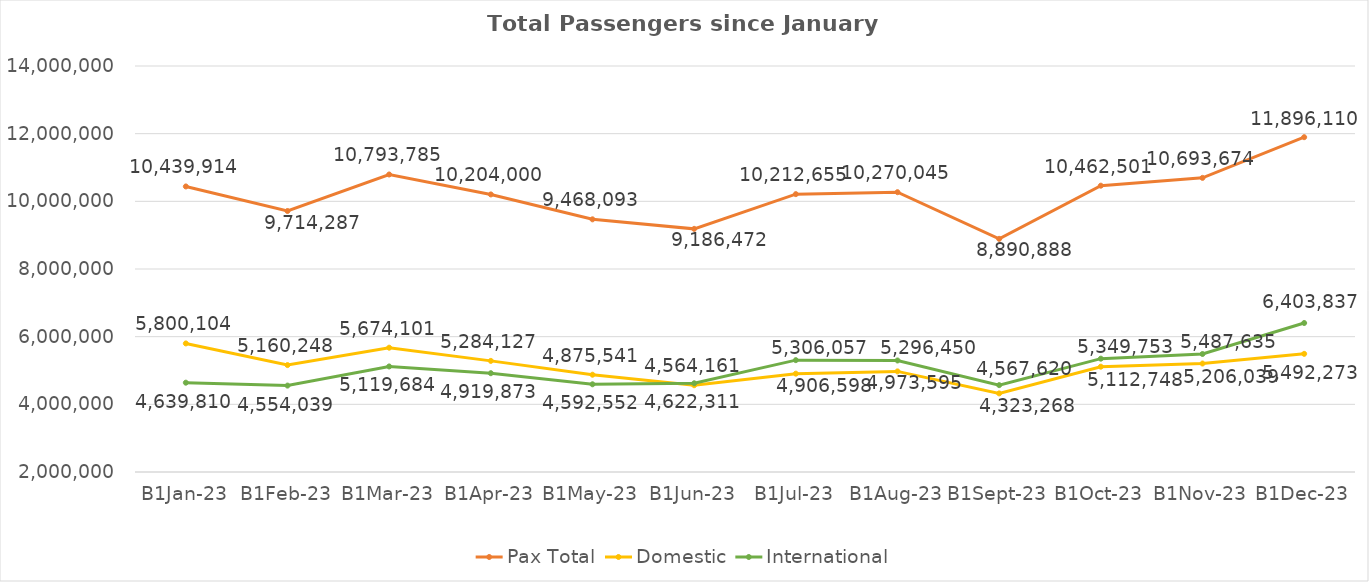
| Category | Pax Total | Domestic | International |
|---|---|---|---|
| 2023-01-01 | 10439914 | 5800104 | 4639810 |
| 2023-02-01 | 9714287 | 5160248 | 4554039 |
| 2023-03-01 | 10793785 | 5674101 | 5119684 |
| 2023-04-01 | 10204000 | 5284127 | 4919873 |
| 2023-05-01 | 9468093 | 4875541 | 4592552 |
| 2023-06-01 | 9186472 | 4564161 | 4622311 |
| 2023-07-01 | 10212655 | 4906598 | 5306057 |
| 2023-08-01 | 10270045 | 4973595 | 5296450 |
| 2023-09-01 | 8890888 | 4323268 | 4567620 |
| 2023-10-01 | 10462501 | 5112748 | 5349753 |
| 2023-11-01 | 10693674 | 5206039 | 5487635 |
| 2023-12-01 | 11896110 | 5492273 | 6403837 |